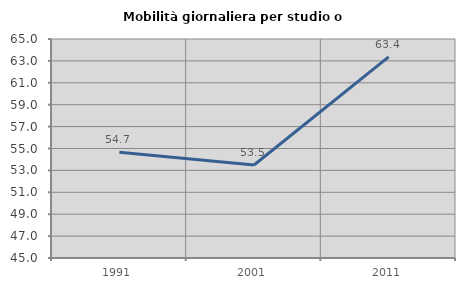
| Category | Mobilità giornaliera per studio o lavoro |
|---|---|
| 1991.0 | 54.661 |
| 2001.0 | 53.493 |
| 2011.0 | 63.369 |